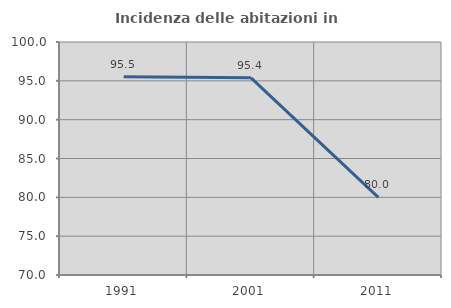
| Category | Incidenza delle abitazioni in proprietà  |
|---|---|
| 1991.0 | 95.522 |
| 2001.0 | 95.385 |
| 2011.0 | 80 |